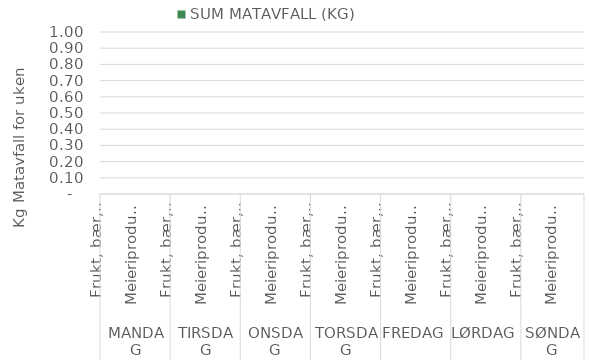
| Category |  SUM MATAVFALL (KG)  |
|---|---|
| 0 | 0 |
| 1 | 0 |
| 2 | 0 |
| 3 | 0 |
| 4 | 0 |
| 5 | 0 |
| 6 | 0 |
| 7 | 0 |
| 8 | 0 |
| 9 | 0 |
| 10 | 0 |
| 11 | 0 |
| 12 | 0 |
| 13 | 0 |
| 14 | 0 |
| 15 | 0 |
| 16 | 0 |
| 17 | 0 |
| 18 | 0 |
| 19 | 0 |
| 20 | 0 |
| 21 | 0 |
| 22 | 0 |
| 23 | 0 |
| 24 | 0 |
| 25 | 0 |
| 26 | 0 |
| 27 | 0 |
| 28 | 0 |
| 29 | 0 |
| 30 | 0 |
| 31 | 0 |
| 32 | 0 |
| 33 | 0 |
| 34 | 0 |
| 35 | 0 |
| 36 | 0 |
| 37 | 0 |
| 38 | 0 |
| 39 | 0 |
| 40 | 0 |
| 41 | 0 |
| 42 | 0 |
| 43 | 0 |
| 44 | 0 |
| 45 | 0 |
| 46 | 0 |
| 47 | 0 |
| 48 | 0 |
| 49 | 0 |
| 50 | 0 |
| 51 | 0 |
| 52 | 0 |
| 53 | 0 |
| 54 | 0 |
| 55 | 0 |
| 56 | 0 |
| 57 | 0 |
| 58 | 0 |
| 59 | 0 |
| 60 | 0 |
| 61 | 0 |
| 62 | 0 |
| 63 | 0 |
| 64 | 0 |
| 65 | 0 |
| 66 | 0 |
| 67 | 0 |
| 68 | 0 |